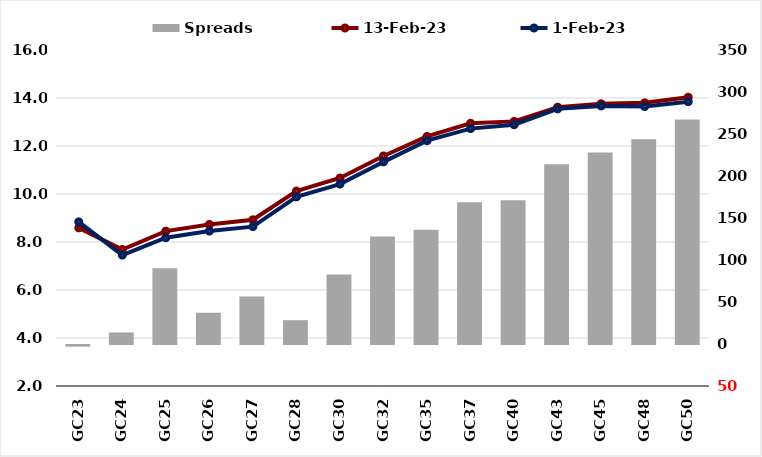
| Category |  Spreads   |
|---|---|
| GC23 | -2.008 |
| GC24 | 13.763 |
| GC25 | 90.291 |
| GC26 | 37.196 |
| GC27 | 56.561 |
| GC28 | 28.381 |
| GC30 | 82.689 |
| GC32 | 128.081 |
| GC35 | 135.88 |
| GC37 | 168.681 |
| GC40 | 171.077 |
| GC43 | 213.966 |
| GC45 | 228.027 |
| GC48 | 243.772 |
| GC50 | 267.24 |